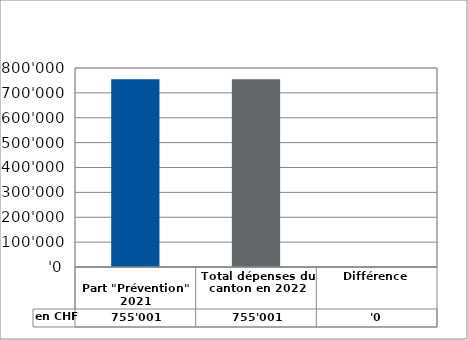
| Category | en CHF |
|---|---|
| 
Part "Prévention" 2021

 | 755001 |
| Total dépenses du canton en 2022 | 755001 |
| Différence | 0 |